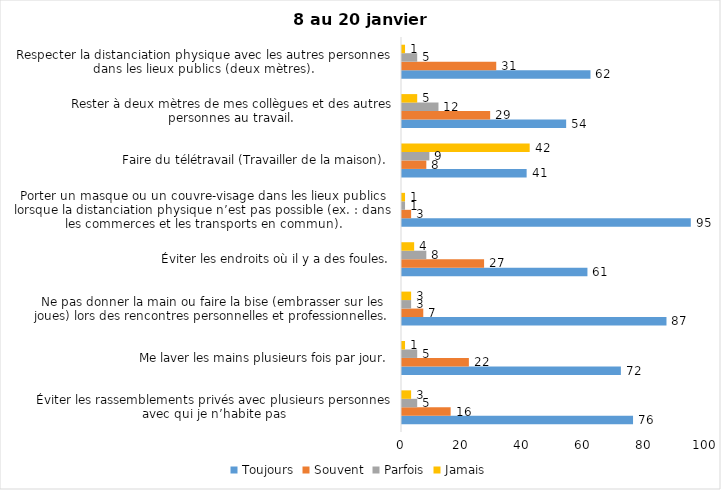
| Category | Toujours | Souvent | Parfois | Jamais |
|---|---|---|---|---|
| Éviter les rassemblements privés avec plusieurs personnes avec qui je n’habite pas | 76 | 16 | 5 | 3 |
| Me laver les mains plusieurs fois par jour. | 72 | 22 | 5 | 1 |
| Ne pas donner la main ou faire la bise (embrasser sur les joues) lors des rencontres personnelles et professionnelles. | 87 | 7 | 3 | 3 |
| Éviter les endroits où il y a des foules. | 61 | 27 | 8 | 4 |
| Porter un masque ou un couvre-visage dans les lieux publics lorsque la distanciation physique n’est pas possible (ex. : dans les commerces et les transports en commun). | 95 | 3 | 1 | 1 |
| Faire du télétravail (Travailler de la maison). | 41 | 8 | 9 | 42 |
| Rester à deux mètres de mes collègues et des autres personnes au travail. | 54 | 29 | 12 | 5 |
| Respecter la distanciation physique avec les autres personnes dans les lieux publics (deux mètres). | 62 | 31 | 5 | 1 |